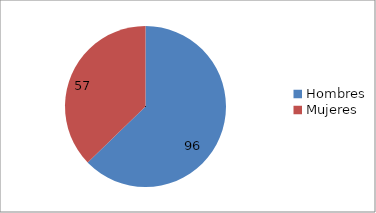
| Category | Series 0 |
|---|---|
| Hombres | 96 |
| Mujeres | 57 |